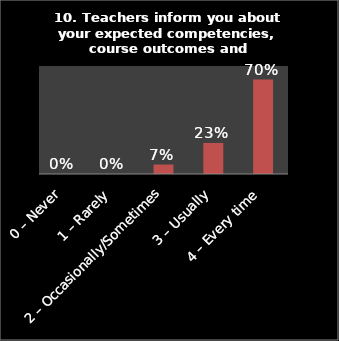
| Category | Series 0 |
|---|---|
| 0 – Never | 0 |
| 1 – Rarely | 0 |
| 2 – Occasionally/Sometimes | 0.07 |
| 3 – Usually | 0.23 |
| 4 – Every time | 0.7 |